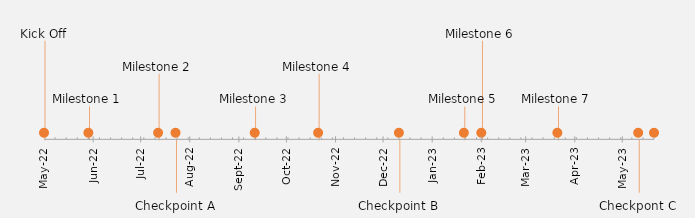
| Category | POSITION |
|---|---|
| Kick Off | 15 |
| Milestone 1 | 5 |
| Milestone 2 | 10 |
| Checkpoint A | -8 |
| Milestone 3 | 5 |
| Milestone 4 | 10 |
| Checkpoint B | -8 |
| Milestone 5 | 5 |
| Milestone 6 | 15 |
| Milestone 7 | 5 |
| Checkpont C | -8 |
| Sign Off | 15 |